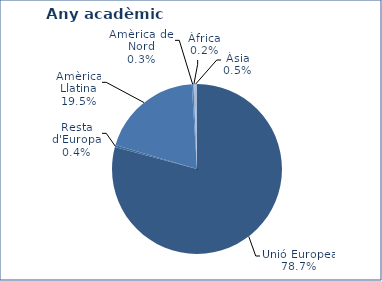
| Category | % |
|---|---|
| Unió Europea | 2412 |
| Resta d'Europa | 12 |
| Amèrica Llatina | 593 |
| Amèrica del Nord | 10 |
| Àfrica | 5 |
| Àsia | 15 |
| Oceania | 0 |